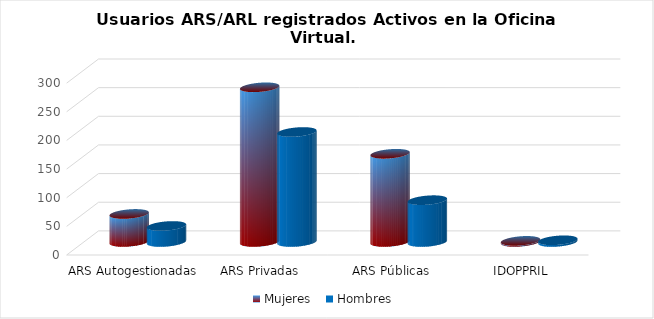
| Category | Mujeres | Hombres |
|---|---|---|
| ARS Autogestionadas | 49 | 28 |
| ARS Privadas | 270 | 192 |
| ARS Públicas | 154 | 73 |
| IDOPPRIL | 2 | 3 |